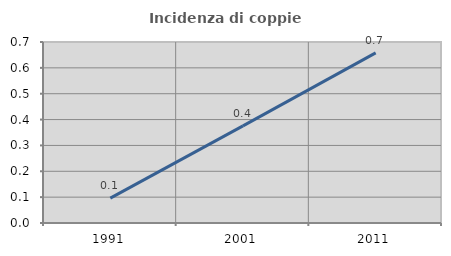
| Category | Incidenza di coppie miste |
|---|---|
| 1991.0 | 0.096 |
| 2001.0 | 0.376 |
| 2011.0 | 0.658 |